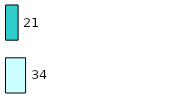
| Category | Series 0 | Series 1 |
|---|---|---|
| 0 | 34 | 21 |